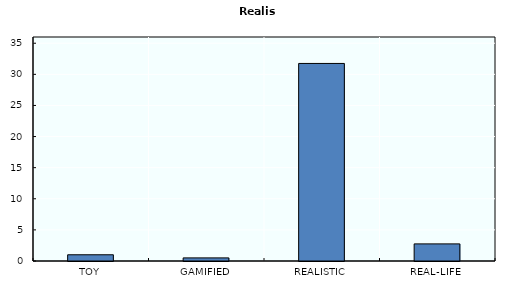
| Category | Realism |
|---|---|
| TOY | 1 |
| GAMIFIED | 0.5 |
| REALISTIC | 31.75 |
| REAL-LIFE | 2.75 |